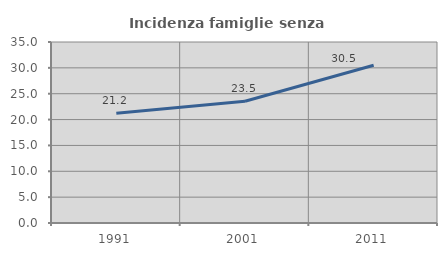
| Category | Incidenza famiglie senza nuclei |
|---|---|
| 1991.0 | 21.237 |
| 2001.0 | 23.547 |
| 2011.0 | 30.512 |